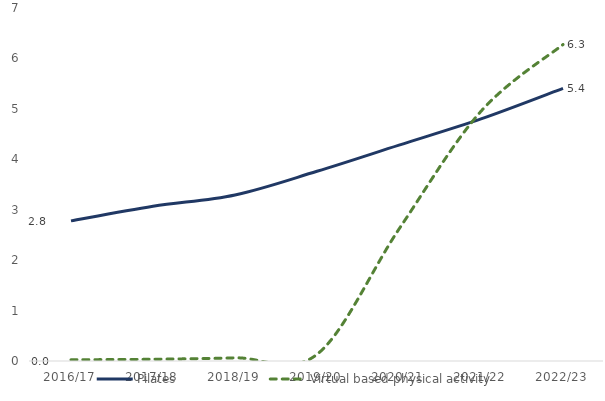
| Category | Pilates | Virtual based physical activity |
|---|---|---|
| 2016/17 | 2.778 | 0.024 |
| 2017/18 | 3.068 | 0.035 |
| 2018/19 | 3.293 | 0.063 |
| 2019/20 | 3.762 | 0.131 |
| 2020/21 | 4.281 | 2.616 |
| 2021/22 | 4.801 | 4.952 |
| 2022/23 | 5.407 | 6.275 |